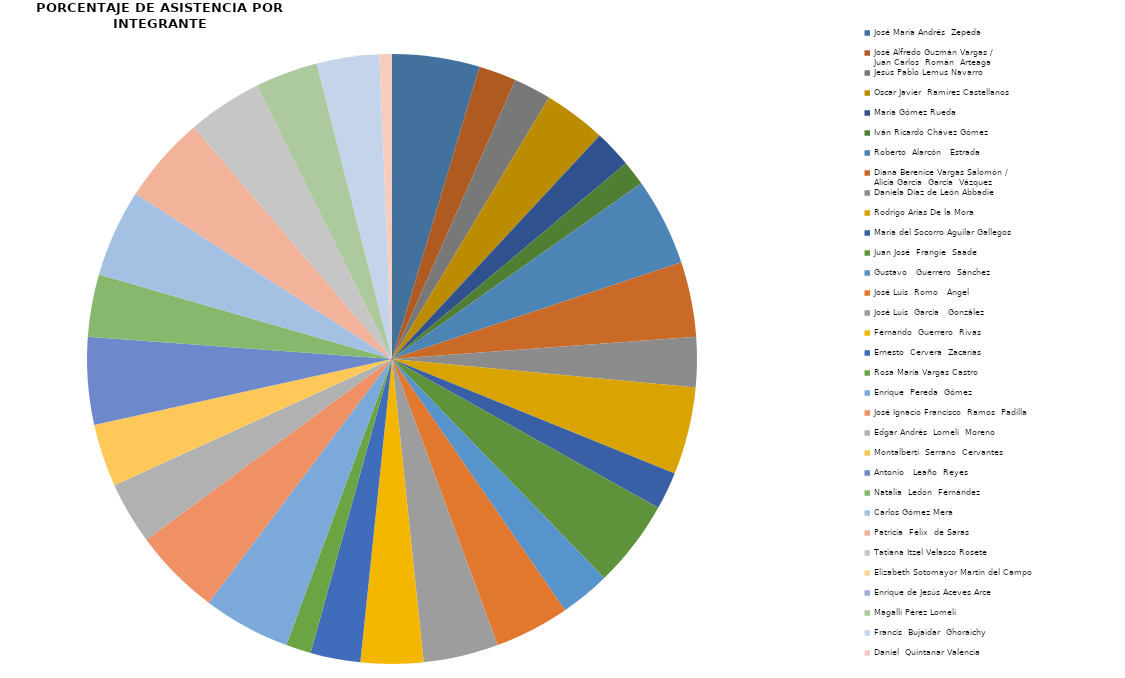
| Category | Series 0 |
|---|---|
| José María Andrés  Zepeda | 7 |
| José Alfredo Guzmán Vargas / 
Juan Carlos  Román  Arteaga | 3 |
| Jesús Pablo Lemus Navarro | 3 |
| Oscar Javier  Ramírez Castellanos | 5 |
| María Gómez Rueda | 3 |
| Iván Ricardo Chávez Gómez | 2 |
| Roberto  Alarcón   Estrada | 7 |
| Diana Berenice Vargas Salomón /
Alicia García  García  Vázquez | 6 |
| Daniela Díaz de León Abbadie | 4 |
| Rodrigo Arias De la Mora | 7 |
| María del Socorro Aguilar Gallegos | 3 |
| Juan José  Frangie  Saade | 7 |
| Gustavo   Guerrero  Sánchez | 4 |
| José Luis  Romo   Ángel | 6 |
| José Luis  García   González | 6 |
| Fernando  Guerrero  Rivas  | 5 |
| Ernesto  Cervera  Zacarías  | 4 |
| Rosa María Vargas Castro | 2 |
| Enrique  Pereda  Gómez | 7 |
| José Ignacio Francisco  Ramos  Padilla | 7 |
| Edgar Andrés  Lomelí  Moreno | 5 |
| Montalberti  Serrano  Cervantes | 5 |
| Antonio   Leaño  Reyes | 7 |
| Natalia  Ledón  Fernández | 5 |
| Carlos Gómez Mera | 7 |
| Patricia  Félix  de Saras  | 7 |
| Tatiana Itzel Velasco Rosete | 6 |
| Elizabeth Sotomayor Martín del Campo | 0 |
| Enrique de Jesús Aceves Arce | 0 |
| Magalli Pérez Lomelí | 5 |
| Francis  Bujaidar  Ghoraichy | 5 |
| Daniel  Quintanar Valencia | 1 |